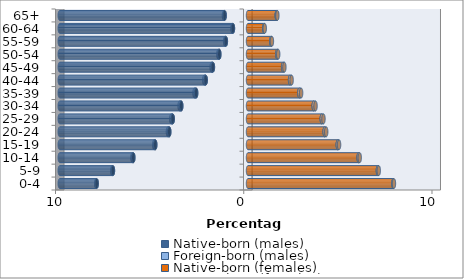
| Category | Native-born (males) | Foreign-born (males) | Native-born (females) | Foreign-born (females) |
|---|---|---|---|---|
| 0-4 | -8.037 | -0.027 | 7.721 | 0.032 |
| 5-9 | -7.174 | -0.041 | 6.898 | 0.05 |
| 10-14 | -6.092 | -0.051 | 5.874 | 0.062 |
| 15-19 | -4.926 | -0.058 | 4.768 | 0.07 |
| 20-24 | -4.183 | -0.072 | 4.072 | 0.083 |
| 25-29 | -3.997 | -0.083 | 3.918 | 0.092 |
| 30-34 | -3.545 | -0.09 | 3.489 | 0.099 |
| 35-39 | -2.753 | -0.089 | 2.726 | 0.096 |
| 40-44 | -2.246 | -0.08 | 2.234 | 0.084 |
| 45-49 | -1.864 | -0.069 | 1.866 | 0.068 |
| 50-54 | -1.523 | -0.054 | 1.554 | 0.05 |
| 55-59 | -1.176 | -0.041 | 1.233 | 0.037 |
| 60-64 | -0.799 | -0.031 | 0.863 | 0.024 |
| 65+ | -1.241 | -0.038 | 1.526 | 0.035 |